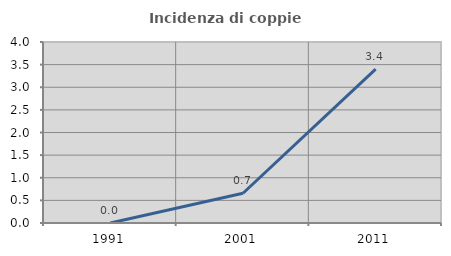
| Category | Incidenza di coppie miste |
|---|---|
| 1991.0 | 0 |
| 2001.0 | 0.658 |
| 2011.0 | 3.401 |